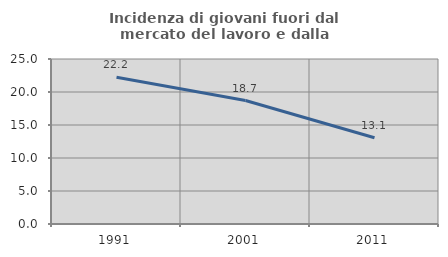
| Category | Incidenza di giovani fuori dal mercato del lavoro e dalla formazione  |
|---|---|
| 1991.0 | 22.246 |
| 2001.0 | 18.711 |
| 2011.0 | 13.063 |